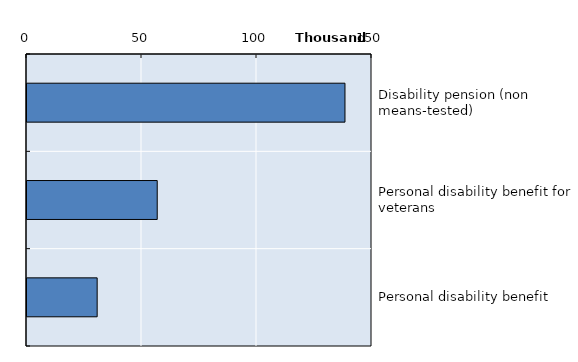
| Category | Series 0 |
|---|---|
| Disability pension (non means-tested) | 138253 |
| Personal disability benefit for veterans | 56621 |
| Personal disability benefit | 30503 |